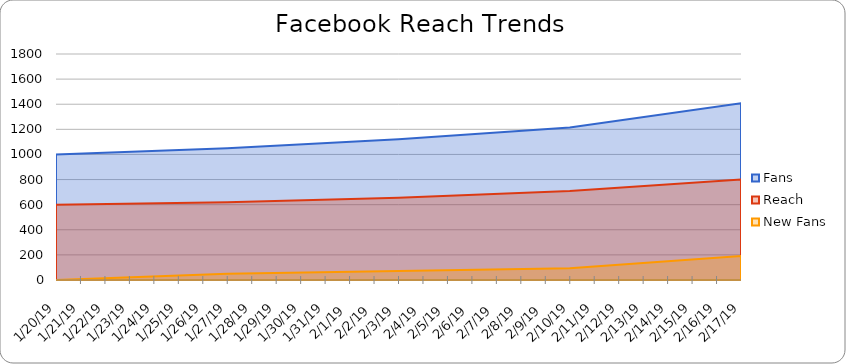
| Category | Fans | Reach | New Fans |
|---|---|---|---|
| 1/20/19 | 1000 | 600 | 0 |
| 1/27/19 | 1050 | 620 | 50 |
| 2/3/19 | 1122 | 655 | 72 |
| 2/10/19 | 1215 | 708 | 93 |
| 2/17/19 | 1407 | 800 | 192 |